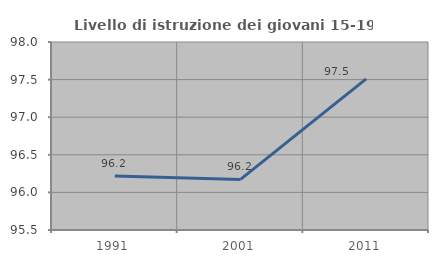
| Category | Livello di istruzione dei giovani 15-19 anni |
|---|---|
| 1991.0 | 96.218 |
| 2001.0 | 96.172 |
| 2011.0 | 97.51 |